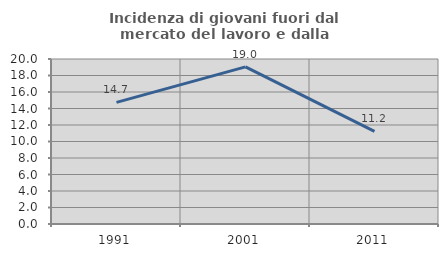
| Category | Incidenza di giovani fuori dal mercato del lavoro e dalla formazione  |
|---|---|
| 1991.0 | 14.737 |
| 2001.0 | 19.048 |
| 2011.0 | 11.224 |